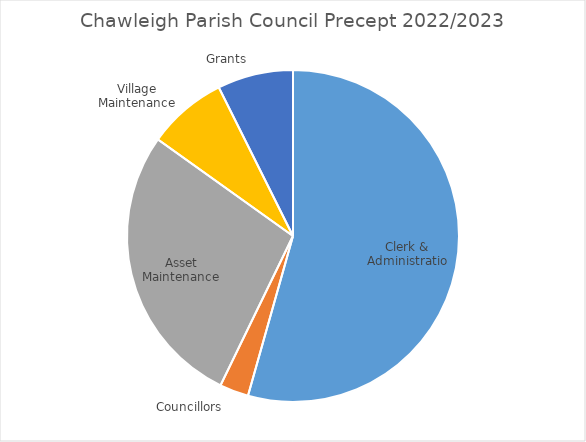
| Category | Series 0 |
|---|---|
| 0 | 30.029 |
| 1 | 1.558 |
| 2 | 15.287 |
| 3 | 4.284 |
| 4 | 4.07 |